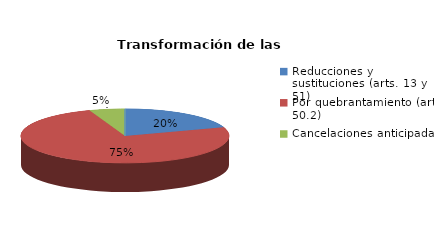
| Category | Series 0 |
|---|---|
| Reducciones y sustituciones (arts. 13 y 51) | 18 |
| Por quebrantamiento (art. 50.2) | 68 |
| Cancelaciones anticipadas | 5 |
| Traslado a Centros Penitenciarios | 0 |
| Conversión internamientos en cerrados (art. 51.2) | 0 |